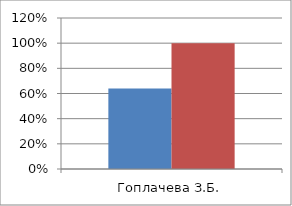
| Category | Series 0 | 2 |
|---|---|---|
| Гоплачева З.Б. | 0.64 | 1 |